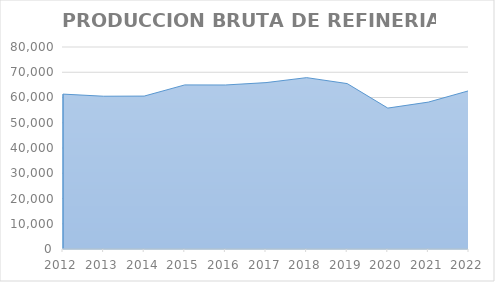
| Category | Series 0 |
|---|---|
| 2012.0 | 61345.652 |
| 2013.0 | 60501.79 |
| 2014.0 | 60562.603 |
| 2015.0 | 64983.196 |
| 2016.0 | 64955.064 |
| 2017.0 | 65897.167 |
| 2018.0 | 67869.642 |
| 2019.0 | 65512.643 |
| 2020.0 | 55806.682 |
| 2021.0 | 58176.796 |
| 2022.0 | 62694.894 |